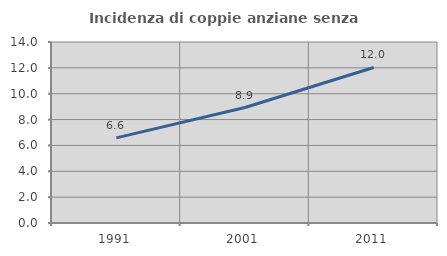
| Category | Incidenza di coppie anziane senza figli  |
|---|---|
| 1991.0 | 6.585 |
| 2001.0 | 8.929 |
| 2011.0 | 12.028 |